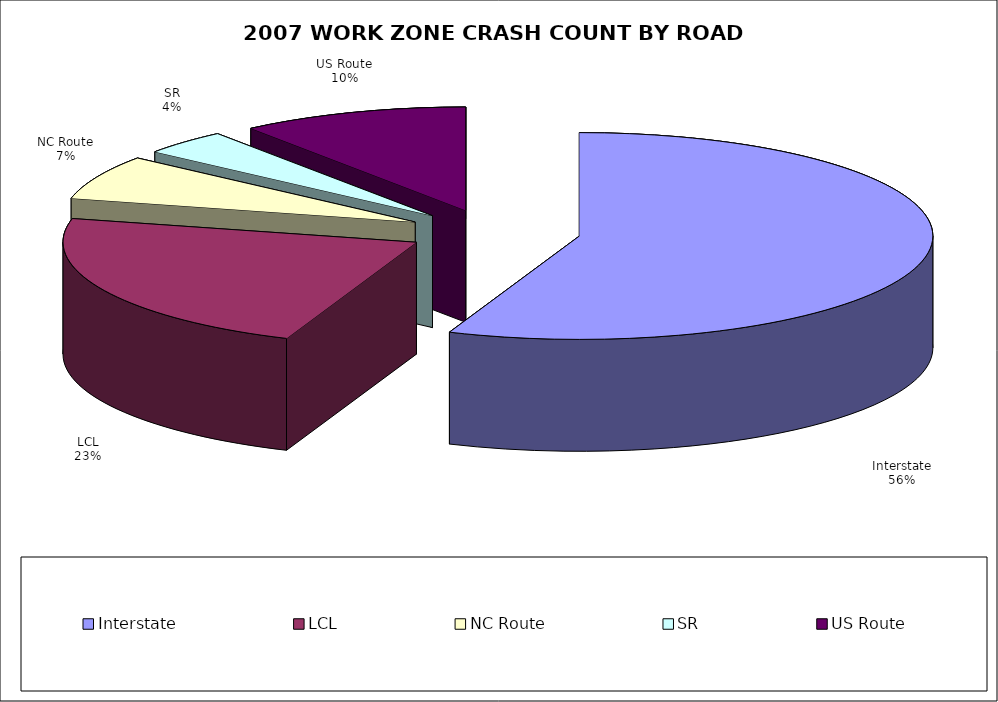
| Category | Series 0 | Series 1 |
|---|---|---|
| Interstate | 3504 | 0.56 |
| LCL | 1420 | 0.227 |
| NC Route | 434 | 0.069 |
| SR | 249 | 0.04 |
| US Route | 651 | 0.104 |